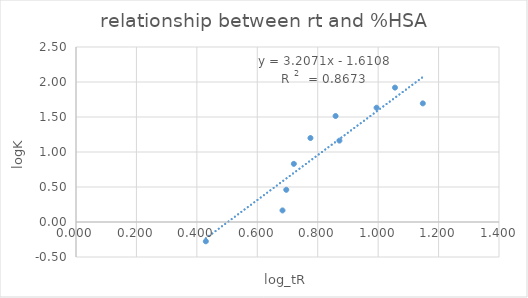
| Category | Series 0 |
|---|---|
| 0.8591382972945308 | 1.514 |
| 0.42970426048878196 | -0.275 |
| 0.6834914879889253 | 0.165 |
| 0.6959190326117648 | 0.46 |
| 0.7209857441537391 | 0.831 |
| 0.8718622535472129 | 1.163 |
| 0.7759743311293691 | 1.2 |
| 0.9947460440628371 | 1.633 |
| 1.1478286239705773 | 1.695 |
| 1.0557562653810408 | 1.92 |